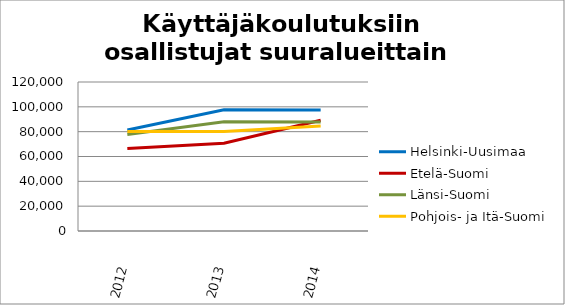
| Category | Helsinki-Uusimaa | Etelä-Suomi | Länsi-Suomi | Pohjois- ja Itä-Suomi |
|---|---|---|---|---|
| 2012.0 | 81383 | 66495 | 77772 | 80229 |
| 2013.0 | 97715 | 70683 | 87896 | 80127 |
| 2014.0 | 97512 | 89153 | 87866 | 84613 |